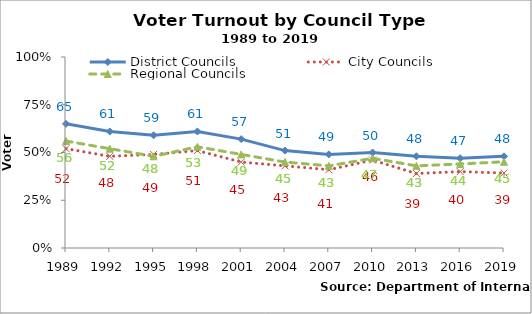
| Category | District Councils | City Councils | Regional Councils |
|---|---|---|---|
| 1989.0 | 0.65 | 0.52 | 0.56 |
| 1992.0 | 0.61 | 0.48 | 0.52 |
| 1995.0 | 0.59 | 0.49 | 0.48 |
| 1998.0 | 0.61 | 0.51 | 0.53 |
| 2001.0 | 0.57 | 0.45 | 0.49 |
| 2004.0 | 0.51 | 0.43 | 0.45 |
| 2007.0 | 0.49 | 0.41 | 0.43 |
| 2010.0 | 0.5 | 0.46 | 0.47 |
| 2013.0 | 0.48 | 0.39 | 0.43 |
| 2016.0 | 0.47 | 0.4 | 0.44 |
| 2019.0 | 0.48 | 0.392 | 0.451 |